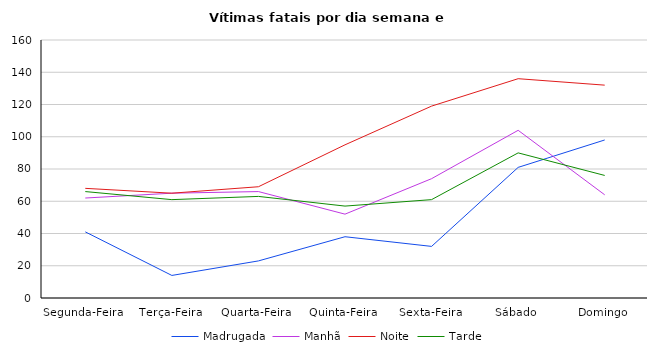
| Category | Madrugada | Manhã | Noite | Tarde |
|---|---|---|---|---|
| Segunda-Feira | 41 | 62 | 68 | 66 |
| Terça-Feira | 14 | 65 | 65 | 61 |
| Quarta-Feira | 23 | 66 | 69 | 63 |
| Quinta-Feira | 38 | 52 | 95 | 57 |
| Sexta-Feira | 32 | 74 | 119 | 61 |
| Sábado | 81 | 104 | 136 | 90 |
| Domingo | 98 | 64 | 132 | 76 |